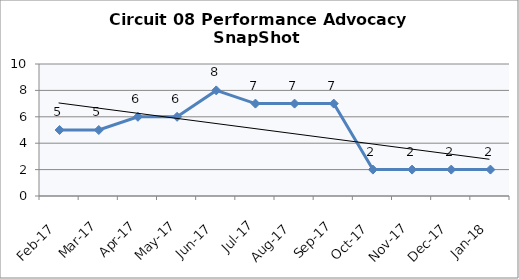
| Category | Circuit 08 |
|---|---|
| Feb-17 | 5 |
| Mar-17 | 5 |
| Apr-17 | 6 |
| May-17 | 6 |
| Jun-17 | 8 |
| Jul-17 | 7 |
| Aug-17 | 7 |
| Sep-17 | 7 |
| Oct-17 | 2 |
| Nov-17 | 2 |
| Dec-17 | 2 |
| Jan-18 | 2 |